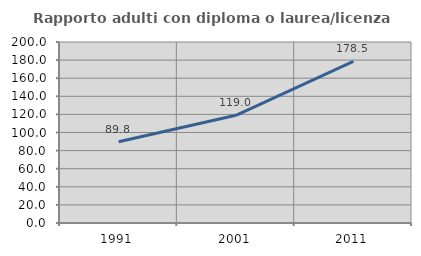
| Category | Rapporto adulti con diploma o laurea/licenza media  |
|---|---|
| 1991.0 | 89.848 |
| 2001.0 | 119.048 |
| 2011.0 | 178.5 |